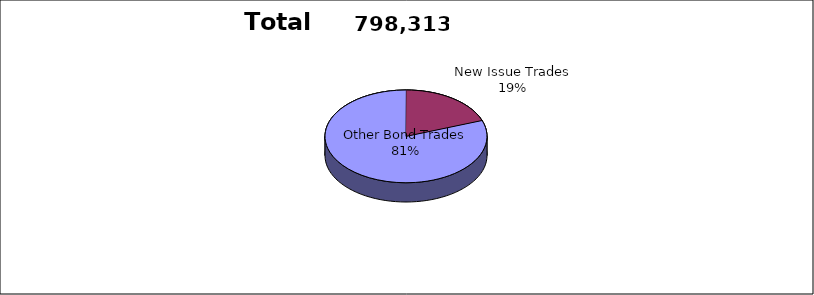
| Category | Series 0 |
|---|---|
| Other Bond Trades | 643691 |
| New Issue Trades | 154622 |